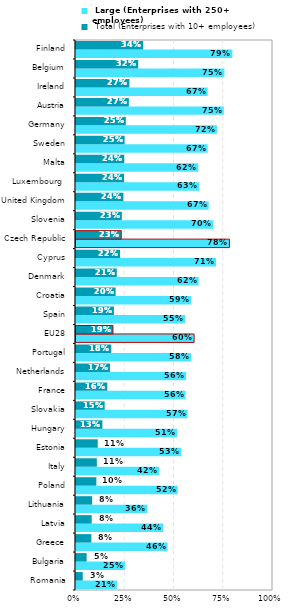
| Category |  Large (Enterprises with 250+ employees) |  Total (Enterprises with 10+ employees) |
|---|---|---|
| Romania | 0.208 | 0.034 |
| Bulgaria | 0.249 | 0.054 |
| Greece | 0.465 | 0.078 |
| Latvia | 0.443 | 0.08 |
| Lithuania | 0.362 | 0.082 |
| Poland | 0.516 | 0.103 |
| Italy | 0.423 | 0.106 |
| Estonia | 0.534 | 0.11 |
| Hungary | 0.513 | 0.134 |
| Slovakia | 0.566 | 0.145 |
| France | 0.556 | 0.159 |
| Netherlands | 0.559 | 0.172 |
| Portugal | 0.584 | 0.179 |
| EU28 | 0.6 | 0.188 |
| Spain | 0.554 | 0.193 |
| Croatia | 0.585 | 0.201 |
| Denmark | 0.623 | 0.207 |
| Cyprus | 0.711 | 0.224 |
| Czech Republic | 0.779 | 0.23 |
| Slovenia | 0.697 | 0.233 |
| United Kingdom | 0.674 | 0.241 |
| Luxembourg  | 0.626 | 0.244 |
| Malta | 0.621 | 0.245 |
| Sweden | 0.668 | 0.247 |
| Germany | 0.716 | 0.253 |
| Austria | 0.75 | 0.268 |
| Ireland | 0.668 | 0.271 |
| Belgium | 0.753 | 0.316 |
| Finland | 0.794 | 0.341 |